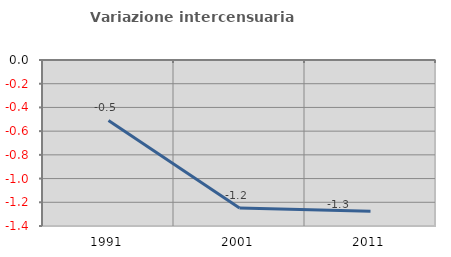
| Category | Variazione intercensuaria annua |
|---|---|
| 1991.0 | -0.509 |
| 2001.0 | -1.248 |
| 2011.0 | -1.277 |